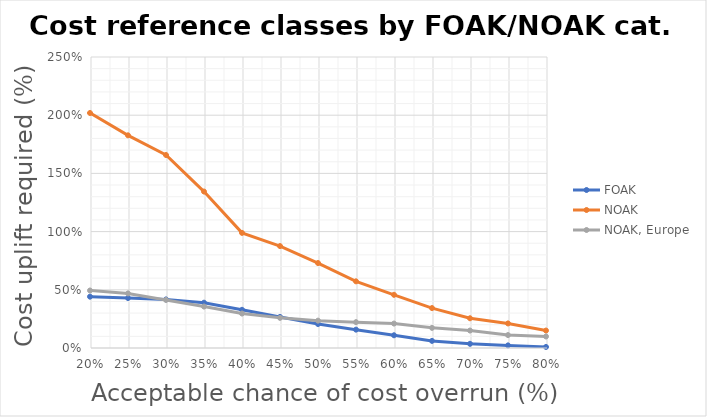
| Category | FOAK | NOAK | NOAK, Europe |
|---|---|---|---|
| 0.8 | 0.009 | 0.15 | 0.099 |
| 0.75 | 0.022 | 0.211 | 0.111 |
| 0.7 | 0.036 | 0.256 | 0.15 |
| 0.65 | 0.061 | 0.343 | 0.173 |
| 0.6 | 0.109 | 0.457 | 0.21 |
| 0.55 | 0.158 | 0.573 | 0.222 |
| 0.5 | 0.206 | 0.73 | 0.235 |
| 0.45 | 0.267 | 0.876 | 0.259 |
| 0.399999999999999 | 0.328 | 0.989 | 0.296 |
| 0.349999999999999 | 0.389 | 1.344 | 0.356 |
| 0.299999999999999 | 0.417 | 1.658 | 0.413 |
| 0.249999999999999 | 0.429 | 1.827 | 0.469 |
| 0.199999999999999 | 0.441 | 2.019 | 0.494 |